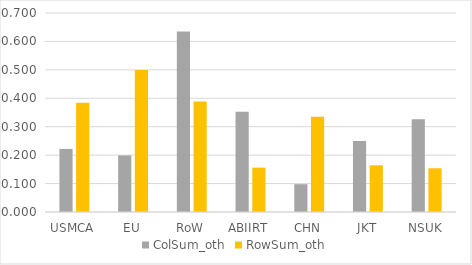
| Category | ColSum_oth | RowSum_oth |
|---|---|---|
| USMCA | 0.222 | 0.385 |
| EU | 0.199 | 0.499 |
| RoW | 0.635 | 0.389 |
| ABIIRT | 0.352 | 0.156 |
| CHN | 0.098 | 0.335 |
| JKT | 0.25 | 0.164 |
| NSUK | 0.327 | 0.154 |